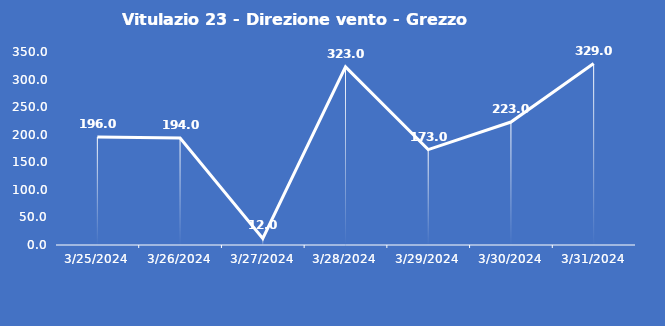
| Category | Vitulazio 23 - Direzione vento - Grezzo (°N) |
|---|---|
| 3/25/24 | 196 |
| 3/26/24 | 194 |
| 3/27/24 | 12 |
| 3/28/24 | 323 |
| 3/29/24 | 173 |
| 3/30/24 | 223 |
| 3/31/24 | 329 |